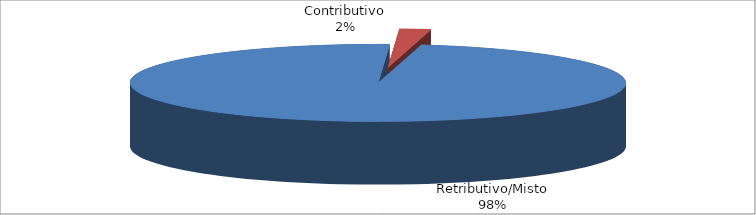
| Category | Decorrenti gennaio - marzo 2023 |
|---|---|
| Retributivo/Misto | 8319 |
| Contributivo | 173 |